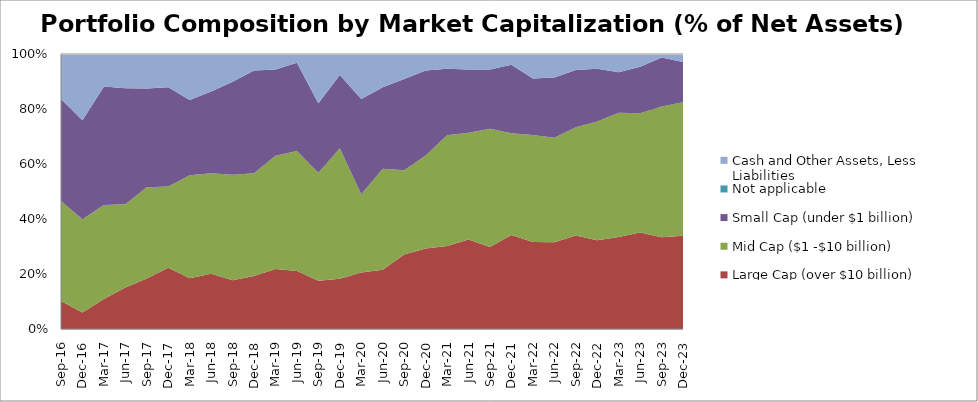
| Category | Large Cap (over $10 billion) | Mid Cap ($1 -$10 billion) | Small Cap (under $1 billion) | Not applicable | Cash and Other Assets, Less Liabilities |
|---|---|---|---|---|---|
| 2016-09-30 | 10.14 | 36.45 | 37.07 | 0 | 16.34 |
| 2016-12-31 | 6 | 33.889 | 36.021 | 0 | 24.09 |
| 2017-03-31 | 10.92 | 34.18 | 43.1 | 0 | 11.79 |
| 2017-06-30 | 15.074 | 30.287 | 42.204 | 0 | 12.434 |
| 2017-09-30 | 18.35 | 33.22 | 35.92 | 0 | 12.51 |
| 2017-12-31 | 22.29 | 29.51 | 36.07 | 0 | 12.13 |
| 2018-03-31 | 18.47 | 37.43 | 27.35 | 0 | 16.75 |
| 2018-06-30 | 20.12 | 36.5 | 29.784 | 0 | 13.6 |
| 2018-09-30 | 17.72 | 38.4 | 33.8 | 0 | 10.08 |
| 2018-12-31 | 19.23 | 37.42 | 37.31 | 0 | 6.04 |
| 2019-03-31 | 21.79 | 41.24 | 31.37 | 0 | 5.6 |
| 2019-06-30 | 21.12 | 43.57 | 32.13 | 0 | 3.18 |
| 2019-09-30 | 17.59 | 39.19 | 25.35 | 0 | 17.87 |
| 2019-12-31 | 18.29 | 47.45 | 26.58 | 0 | 7.68 |
| 2020-03-31 | 20.58 | 28.39 | 34.71 | 0 | 16.32 |
| 2020-06-30 | 21.53 | 36.7 | 29.68 | 0 | 12.09 |
| 2020-09-30 | 27.11 | 30.6 | 33.24 | 0 | 9.05 |
| 2020-12-31 | 29.23 | 33.9 | 30.83 | 0 | 6.04 |
| 2021-03-31 | 30.2 | 40.22 | 24.21 | 0 | 5.37 |
| 2021-06-30 | 32.52 | 38.86 | 22.95 | 0 | 5.67 |
| 2021-09-30 | 29.86 | 42.93 | 21.53 | 0 | 5.68 |
| 2021-12-31 | 34.2 | 36.98 | 24.95 | 0 | 3.87 |
| 2022-03-31 | 31.6 | 38.97 | 20.51 | 0 | 8.92 |
| 2022-06-30 | 31.54 | 38 | 21.9 | 0 | 8.56 |
| 2022-09-30 | 33.98 | 39.41 | 20.8 | 0 | 5.81 |
| 2022-12-31 | 32.27 | 43.14 | 19.24 | 0 | 5.35 |
| 2023-03-31 | 33.45 | 45.19 | 14.71 | 0 | 6.65 |
| 2023-06-30 | 35.05 | 43.36 | 16.94 | 0 | 4.65 |
| 2023-09-30 | 33.35 | 47.54 | 17.87 | 0 | 1.24 |
| 2023-12-31 | 33.89 | 48.53 | 14.66 | 0 | 2.92 |